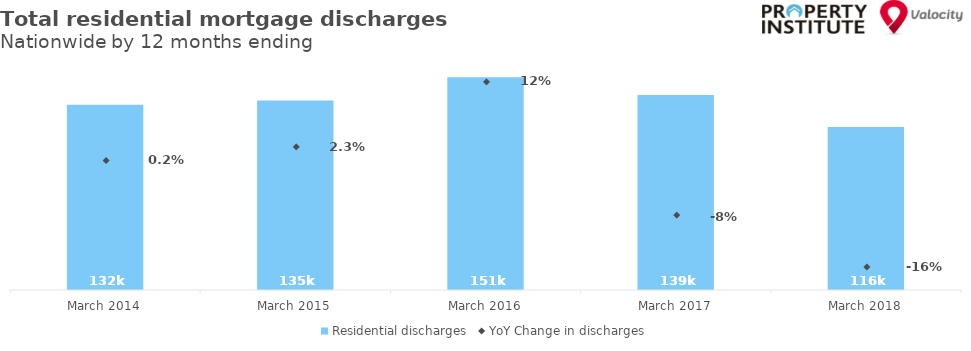
| Category | Residential discharges |
|---|---|
| 2014-03-01 | 131687 |
| 2015-03-01 | 134671 |
| 2016-03-01 | 151352 |
| 2017-03-01 | 138724 |
| 2018-03-01 | 115949 |